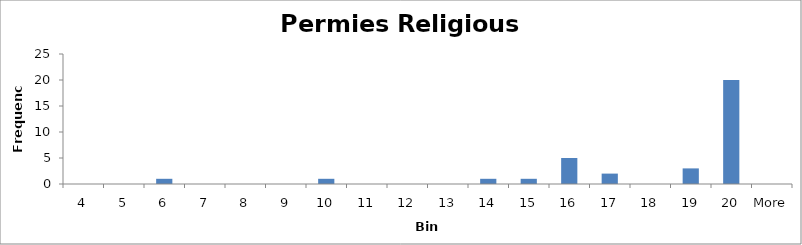
| Category | Frequency |
|---|---|
| 4 | 0 |
| 5 | 0 |
| 6 | 1 |
| 7 | 0 |
| 8 | 0 |
| 9 | 0 |
| 10 | 1 |
| 11 | 0 |
| 12 | 0 |
| 13 | 0 |
| 14 | 1 |
| 15 | 1 |
| 16 | 5 |
| 17 | 2 |
| 18 | 0 |
| 19 | 3 |
| 20 | 20 |
| More | 0 |